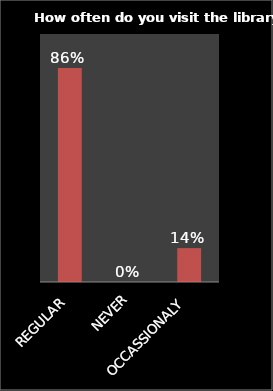
| Category | Series 0 |
|---|---|
| REGULAR | 0.863 |
| NEVER | 0 |
| OCCASSIONALY | 0.137 |